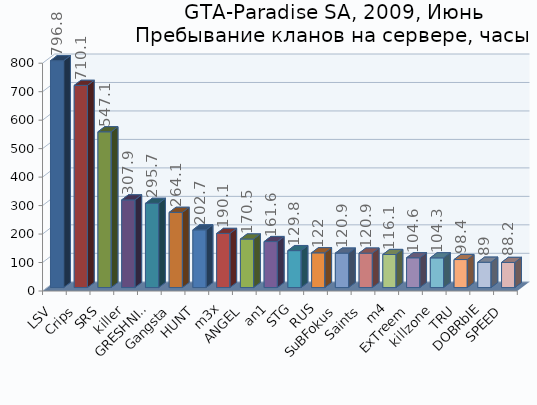
| Category | Series 0 |
|---|---|
| LSV | 796.8 |
| Crips | 710.1 |
| SRS | 547.1 |
| killer | 307.9 |
| GRESHNIKI | 295.7 |
| Gangsta | 264.1 |
| HUNT | 202.7 |
| m3x | 190.1 |
| ANGEL | 170.5 |
| an1 | 161.6 |
| STG | 129.8 |
| RUS | 122 |
| SuBFokus | 120.9 |
| Saints | 120.9 |
| m4 | 116.1 |
| ExTreem | 104.6 |
| killzone | 104.3 |
| TRU | 98.4 |
| DOBRbIE | 89 |
| SPEED | 88.2 |